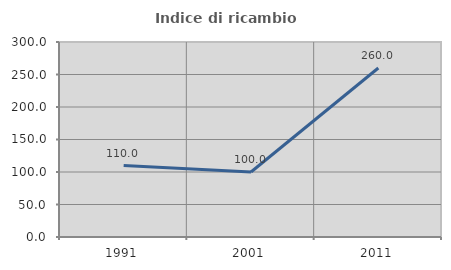
| Category | Indice di ricambio occupazionale  |
|---|---|
| 1991.0 | 110 |
| 2001.0 | 100 |
| 2011.0 | 260 |